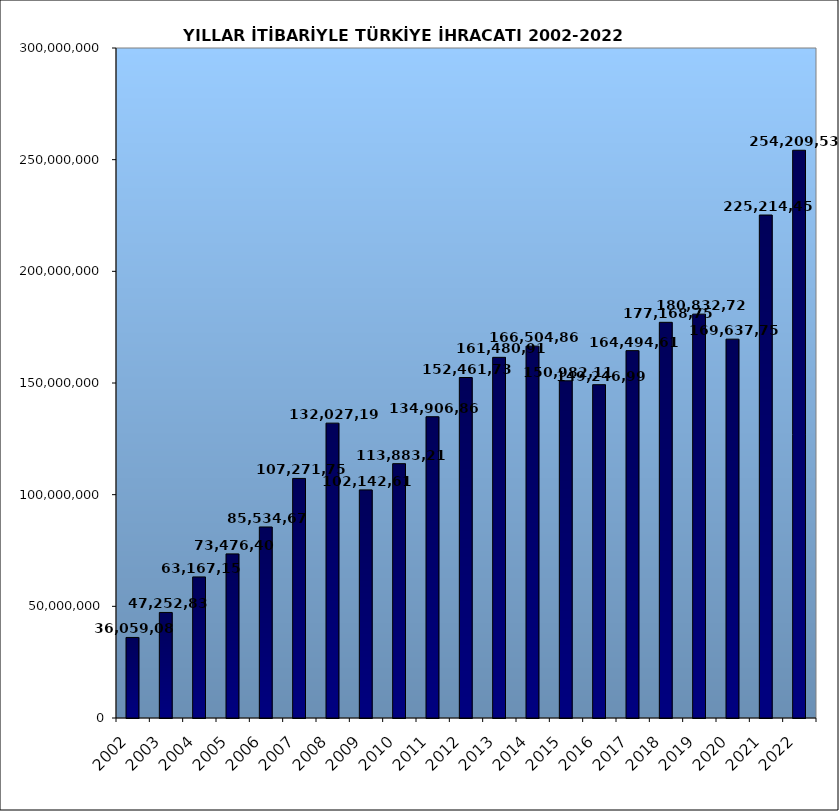
| Category | 2002 |
|---|---|
| 2002.0 | 36059089.029 |
| 2003.0 | 47252836.302 |
| 2004.0 | 63167152.82 |
| 2005.0 | 73476408.143 |
| 2006.0 | 85534675.518 |
| 2007.0 | 107271749.904 |
| 2008.0 | 132027195.626 |
| 2009.0 | 102142612.603 |
| 2010.0 | 113883219.184 |
| 2011.0 | 134906868.83 |
| 2012.0 | 152461736.556 |
| 2013.0 | 161480914.702 |
| 2014.0 | 166504861.795 |
| 2015.0 | 150982113.766 |
| 2016.0 | 149246999.263 |
| 2017.0 | 164494619.316 |
| 2018.0 | 177168756.288 |
| 2019.0 | 180832721.702 |
| 2020.0 | 169637755.31 |
| 2021.0 | 225214458.038 |
| 2022.0 | 254209534.953 |